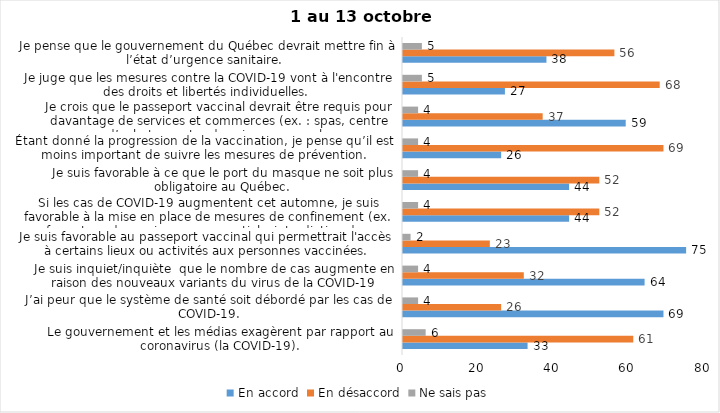
| Category | En accord | En désaccord | Ne sais pas |
|---|---|---|---|
| Le gouvernement et les médias exagèrent par rapport au coronavirus (la COVID-19). | 33 | 61 | 6 |
| J’ai peur que le système de santé soit débordé par les cas de COVID-19. | 69 | 26 | 4 |
| Je suis inquiet/inquiète  que le nombre de cas augmente en raison des nouveaux variants du virus de la COVID-19 | 64 | 32 | 4 |
| Je suis favorable au passeport vaccinal qui permettrait l'accès à certains lieux ou activités aux personnes vaccinées. | 75 | 23 | 2 |
| Si les cas de COVID-19 augmentent cet automne, je suis favorable à la mise en place de mesures de confinement (ex. fermeture de services non essentiels, interdiction des rassemblements privés) | 44 | 52 | 4 |
| Je suis favorable à ce que le port du masque ne soit plus obligatoire au Québec. | 44 | 52 | 4 |
| Étant donné la progression de la vaccination, je pense qu’il est moins important de suivre les mesures de prévention. | 26 | 69 | 4 |
| Je crois que le passeport vaccinal devrait être requis pour davantage de services et commerces (ex. : spas, centre d’achats, centre de soins personnels. | 59 | 37 | 4 |
| Je juge que les mesures contre la COVID-19 vont à l'encontre des droits et libertés individuelles.  | 27 | 68 | 5 |
| Je pense que le gouvernement du Québec devrait mettre fin à l’état d’urgence sanitaire.  | 38 | 56 | 5 |